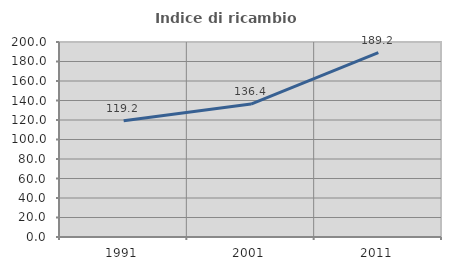
| Category | Indice di ricambio occupazionale  |
|---|---|
| 1991.0 | 119.178 |
| 2001.0 | 136.364 |
| 2011.0 | 189.189 |